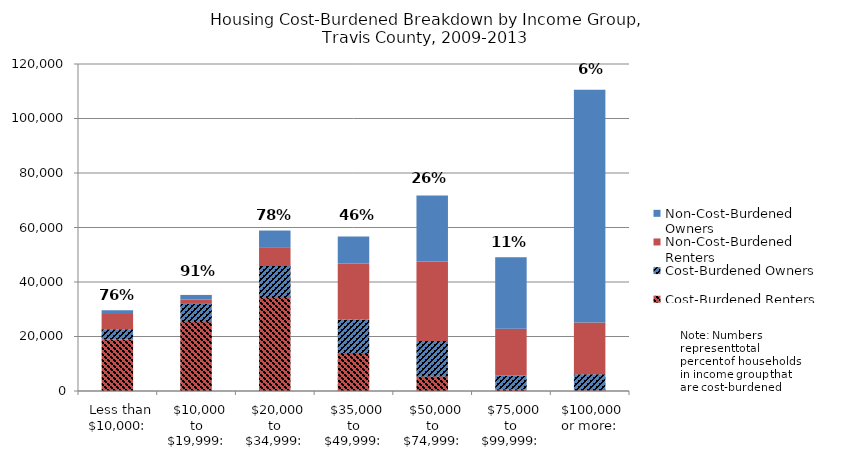
| Category | Cost-Burdened Renters | Cost-Burdened Owners | Non-Cost-Burdened Renters | Non-Cost-Burdened Owners |
|---|---|---|---|---|
|   Less than $10,000: | 18863 | 3758 | 5594 | 1426 |
|   $10,000 to $19,999: | 25295 | 6666 | 1573 | 1716 |
|   $20,000 to $34,999: | 34104 | 11762 | 6906 | 6113 |
|   $35,000 to $49,999: | 13973 | 12241 | 20609 | 9904 |
|   $50,000 to $74,999: | 5364 | 13002 | 29202 | 24154 |
|   $75,000 to $99,999: | 623 | 4932 | 17331 | 26214 |
|   $100,000 or more: | 309 | 5878 | 18939 | 85425 |